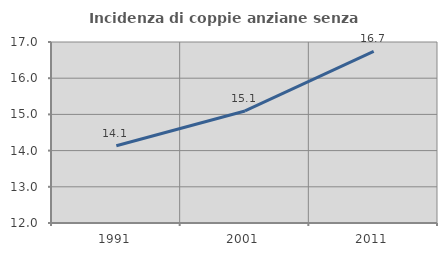
| Category | Incidenza di coppie anziane senza figli  |
|---|---|
| 1991.0 | 14.134 |
| 2001.0 | 15.094 |
| 2011.0 | 16.739 |